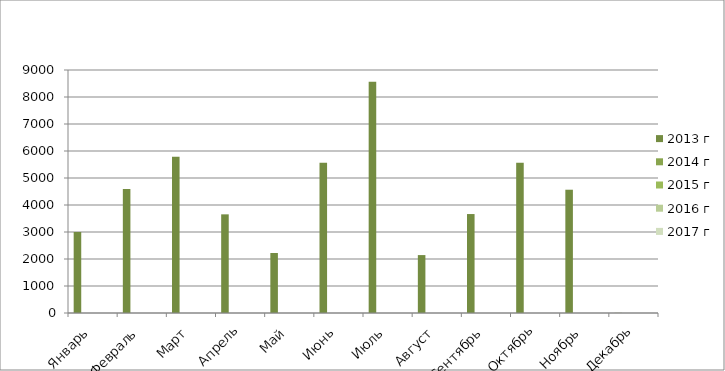
| Category | 2013 г | 2014 г | 2015 г | 2016 г | 2017 г |
|---|---|---|---|---|---|
| Январь  | 3000 |  |  |  |  |
| Февраль  | 4596 |  |  |  |  |
| Март | 5784 |  |  |  |  |
| Апрель | 3654 |  |  |  |  |
| Май | 2222 |  |  |  |  |
| Июнь | 5569 |  |  |  |  |
| Июль | 8569 |  |  |  |  |
| Август | 2145 |  |  |  |  |
| Сентябрь | 3665 |  |  |  |  |
| Октябрь | 5566 |  |  |  |  |
| Ноябрь | 4566 |  |  |  |  |
| Декабрь | 5 |  |  |  |  |